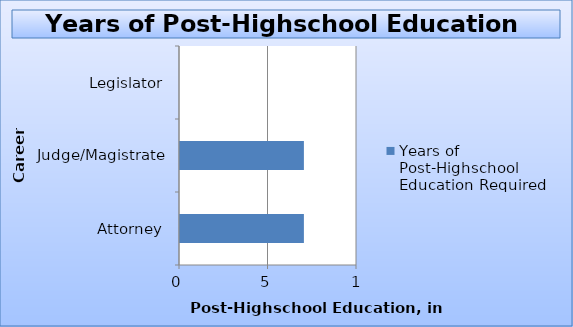
| Category | Years of Post-Highschool Education Required |
|---|---|
| Attorney | 7 |
| Judge/Magistrate | 7 |
| Legislator | 0 |